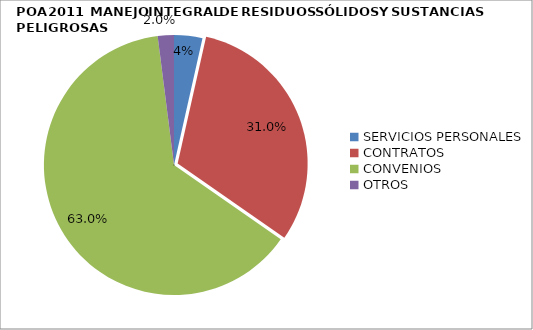
| Category | Series 0 | Series 1 |
|---|---|---|
| SERVICIOS PERSONALES |  | 0.035 |
| CONTRATOS |  | 0.31 |
| CONVENIOS |  | 0.63 |
| OTROS |  | 0.02 |